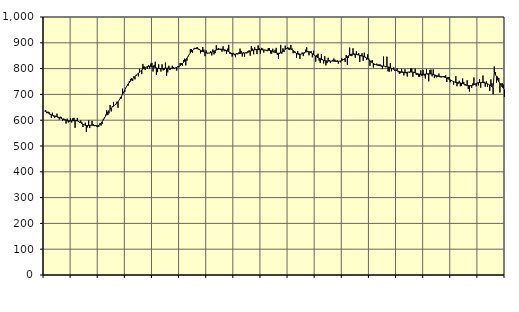
| Category | Piggar | Series 1 |
|---|---|---|
| nan | 635.8 | 635.22 |
| 87.0 | 639.2 | 633.33 |
| 87.0 | 627.2 | 631.18 |
| 87.0 | 633.3 | 628.64 |
| 87.0 | 631.3 | 626.18 |
| 87.0 | 620.2 | 623.75 |
| 87.0 | 608.4 | 621.52 |
| 87.0 | 629.1 | 619.48 |
| 87.0 | 614.6 | 617.67 |
| 87.0 | 609.2 | 616.18 |
| 87.0 | 616.9 | 614.82 |
| 87.0 | 625.4 | 613.54 |
| nan | 609.7 | 612.13 |
| 88.0 | 602.8 | 610.52 |
| 88.0 | 613.5 | 608.64 |
| 88.0 | 612.7 | 606.52 |
| 88.0 | 597.7 | 604.41 |
| 88.0 | 606.2 | 602.5 |
| 88.0 | 604.1 | 600.86 |
| 88.0 | 586.9 | 599.54 |
| 88.0 | 605.7 | 598.56 |
| 88.0 | 591.1 | 597.95 |
| 88.0 | 595 | 597.66 |
| 88.0 | 606.8 | 597.64 |
| nan | 591 | 597.83 |
| 89.0 | 607.4 | 598.1 |
| 89.0 | 609.1 | 598.35 |
| 89.0 | 570.4 | 598.39 |
| 89.0 | 599.9 | 597.93 |
| 89.0 | 608.9 | 596.9 |
| 89.0 | 596.8 | 595.23 |
| 89.0 | 591.5 | 592.95 |
| 89.0 | 599 | 590.24 |
| 89.0 | 592.1 | 587.35 |
| 89.0 | 573.6 | 584.61 |
| 89.0 | 583 | 582.26 |
| nan | 590.2 | 580.51 |
| 90.0 | 554.4 | 579.52 |
| 90.0 | 572.1 | 579.17 |
| 90.0 | 599 | 579.41 |
| 90.0 | 569.5 | 580.02 |
| 90.0 | 581.3 | 580.53 |
| 90.0 | 597.3 | 580.66 |
| 90.0 | 584.3 | 580.34 |
| 90.0 | 576.8 | 579.59 |
| 90.0 | 581.5 | 578.76 |
| 90.0 | 575.7 | 578.39 |
| 90.0 | 573.2 | 578.85 |
| nan | 574.5 | 580.53 |
| 91.0 | 588 | 583.68 |
| 91.0 | 579.1 | 588.31 |
| 91.0 | 586 | 594.16 |
| 91.0 | 605.4 | 600.95 |
| 91.0 | 611.6 | 608.39 |
| 91.0 | 621.3 | 616.11 |
| 91.0 | 638.4 | 623.67 |
| 91.0 | 619.7 | 630.74 |
| 91.0 | 626.5 | 637.09 |
| 91.0 | 659 | 642.47 |
| 91.0 | 634 | 646.98 |
| nan | 653.8 | 650.87 |
| 92.0 | 670.9 | 654.46 |
| 92.0 | 658.4 | 658.07 |
| 92.0 | 659.5 | 662.07 |
| 92.0 | 671.4 | 666.63 |
| 92.0 | 647.9 | 671.82 |
| 92.0 | 677.5 | 677.72 |
| 92.0 | 687.6 | 684.43 |
| 92.0 | 684 | 691.93 |
| 92.0 | 722.5 | 700.16 |
| 92.0 | 706 | 708.77 |
| 92.0 | 709.8 | 717.35 |
| nan | 726.6 | 725.66 |
| 93.0 | 733.6 | 733.27 |
| 93.0 | 734.3 | 740.02 |
| 93.0 | 751.4 | 746.06 |
| 93.0 | 760.1 | 751.41 |
| 93.0 | 762 | 756.18 |
| 93.0 | 751.8 | 760.64 |
| 93.0 | 769.9 | 764.85 |
| 93.0 | 758.3 | 769.03 |
| 93.0 | 776.1 | 773.23 |
| 93.0 | 777.8 | 777.51 |
| 93.0 | 769.7 | 781.92 |
| nan | 799.1 | 786.3 |
| 94.0 | 790.3 | 790.58 |
| 94.0 | 778.5 | 794.63 |
| 94.0 | 818.1 | 798.2 |
| 94.0 | 808.9 | 801.27 |
| 94.0 | 794.8 | 803.93 |
| 94.0 | 806.3 | 806.07 |
| 94.0 | 798.6 | 807.67 |
| 94.0 | 813.2 | 808.71 |
| 94.0 | 800.3 | 809.13 |
| 94.0 | 819.2 | 808.95 |
| 94.0 | 822.6 | 808.29 |
| nan | 788.6 | 807.15 |
| 95.0 | 814.4 | 805.64 |
| 95.0 | 826.7 | 804.1 |
| 95.0 | 776 | 802.64 |
| 95.0 | 786.5 | 801.35 |
| 95.0 | 816.6 | 800.46 |
| 95.0 | 798.3 | 800.02 |
| 95.0 | 788.6 | 799.94 |
| 95.0 | 816.6 | 800.19 |
| 95.0 | 793 | 800.61 |
| 95.0 | 795.5 | 801.14 |
| 95.0 | 823.4 | 801.55 |
| nan | 772.8 | 801.8 |
| 96.0 | 785.7 | 801.83 |
| 96.0 | 811.1 | 801.55 |
| 96.0 | 794.5 | 801.18 |
| 96.0 | 801.4 | 800.99 |
| 96.0 | 811.1 | 800.91 |
| 96.0 | 805.1 | 801.14 |
| 96.0 | 798.2 | 801.92 |
| 96.0 | 802 | 803.22 |
| 96.0 | 792.3 | 804.94 |
| 96.0 | 809.6 | 807.02 |
| 96.0 | 804.9 | 809.36 |
| nan | 822 | 812.07 |
| 97.0 | 821.5 | 815.38 |
| 97.0 | 810.8 | 819.34 |
| 97.0 | 832.6 | 823.92 |
| 97.0 | 838.5 | 829.12 |
| 97.0 | 812.4 | 834.83 |
| 97.0 | 830.4 | 840.97 |
| 97.0 | 848.9 | 847.5 |
| 97.0 | 853.7 | 854.23 |
| 97.0 | 875.2 | 860.78 |
| 97.0 | 875.2 | 866.71 |
| 97.0 | 861.5 | 871.63 |
| nan | 877.1 | 875.21 |
| 98.0 | 880.6 | 877.29 |
| 98.0 | 877.4 | 877.93 |
| 98.0 | 883.7 | 877.33 |
| 98.0 | 877.5 | 875.71 |
| 98.0 | 876.2 | 873.56 |
| 98.0 | 859.2 | 871.22 |
| 98.0 | 865.1 | 868.88 |
| 98.0 | 883.6 | 866.7 |
| 98.0 | 873.6 | 864.68 |
| 98.0 | 848.3 | 862.88 |
| 98.0 | 870.6 | 861.47 |
| nan | 858.5 | 860.59 |
| 99.0 | 860 | 860.3 |
| 99.0 | 859.6 | 860.67 |
| 99.0 | 867.2 | 861.63 |
| 99.0 | 850.9 | 863.12 |
| 99.0 | 874.3 | 865.07 |
| 99.0 | 854.9 | 867.4 |
| 99.0 | 860 | 869.83 |
| 99.0 | 890.2 | 871.92 |
| 99.0 | 876.9 | 873.49 |
| 99.0 | 879.2 | 874.55 |
| 99.0 | 876.4 | 875.18 |
| nan | 871.8 | 875.31 |
| 0.0 | 865.6 | 875 |
| 0.0 | 886.4 | 874.3 |
| 0.0 | 867.1 | 873.21 |
| 0.0 | 868.1 | 871.74 |
| 0.0 | 856.6 | 869.93 |
| 0.0 | 877.2 | 867.72 |
| 0.0 | 892.1 | 865.23 |
| 0.0 | 857 | 862.65 |
| 0.0 | 857.3 | 860.17 |
| 0.0 | 846.5 | 858.17 |
| 0.0 | 859.5 | 856.82 |
| nan | 851.8 | 856.19 |
| 1.0 | 844.1 | 856.22 |
| 1.0 | 860.1 | 856.71 |
| 1.0 | 855.4 | 857.54 |
| 1.0 | 863.1 | 858.48 |
| 1.0 | 877.4 | 859.3 |
| 1.0 | 868.6 | 859.9 |
| 1.0 | 847 | 860.16 |
| 1.0 | 862.8 | 860.23 |
| 1.0 | 846.2 | 860.51 |
| 1.0 | 862.2 | 861.08 |
| 1.0 | 858.9 | 862 |
| nan | 867.8 | 863.36 |
| 2.0 | 871.2 | 865.11 |
| 2.0 | 850.1 | 867.08 |
| 2.0 | 887.4 | 869.03 |
| 2.0 | 877.4 | 870.76 |
| 2.0 | 855.4 | 872.08 |
| 2.0 | 882.6 | 872.93 |
| 2.0 | 874 | 873.39 |
| 2.0 | 856.1 | 873.52 |
| 2.0 | 890 | 873.44 |
| 2.0 | 879.5 | 873.33 |
| 2.0 | 858.4 | 873.16 |
| nan | 880 | 872.95 |
| 3.0 | 878.2 | 872.66 |
| 3.0 | 862 | 872.24 |
| 3.0 | 872.6 | 871.77 |
| 3.0 | 870.5 | 871.34 |
| 3.0 | 867.4 | 871.06 |
| 3.0 | 879.6 | 870.87 |
| 3.0 | 879.6 | 870.55 |
| 3.0 | 858.9 | 869.89 |
| 3.0 | 857.8 | 868.8 |
| 3.0 | 876.7 | 867.11 |
| 3.0 | 862.3 | 865.05 |
| nan | 872.7 | 862.92 |
| 4.0 | 880.3 | 861.01 |
| 4.0 | 853.4 | 859.77 |
| 4.0 | 837.1 | 859.41 |
| 4.0 | 856.8 | 860.03 |
| 4.0 | 891.7 | 861.68 |
| 4.0 | 857.8 | 864.24 |
| 4.0 | 878.7 | 867.42 |
| 4.0 | 864.2 | 871 |
| 4.0 | 889 | 874.52 |
| 4.0 | 879.7 | 877.37 |
| 4.0 | 882 | 879.15 |
| nan | 873.8 | 879.59 |
| 5.0 | 871.7 | 878.56 |
| 5.0 | 891.3 | 876.31 |
| 5.0 | 878.2 | 873.25 |
| 5.0 | 859.6 | 869.68 |
| 5.0 | 862.2 | 865.8 |
| 5.0 | 865.2 | 862.01 |
| 5.0 | 840.8 | 858.79 |
| 5.0 | 867.5 | 856.43 |
| 5.0 | 859.9 | 855.13 |
| 5.0 | 837.7 | 854.98 |
| 5.0 | 855.8 | 855.88 |
| nan | 862.6 | 857.58 |
| 6.0 | 848.5 | 859.84 |
| 6.0 | 859.3 | 862.17 |
| 6.0 | 873.3 | 864.02 |
| 6.0 | 882.6 | 865.18 |
| 6.0 | 868.4 | 865.55 |
| 6.0 | 851.4 | 864.89 |
| 6.0 | 866.4 | 863.25 |
| 6.0 | 867.3 | 860.85 |
| 6.0 | 843.8 | 857.79 |
| 6.0 | 869.2 | 854.5 |
| 6.0 | 852.1 | 851.33 |
| nan | 827.2 | 848.27 |
| 7.0 | 853.2 | 845.4 |
| 7.0 | 857.9 | 842.79 |
| 7.0 | 830.4 | 840.35 |
| 7.0 | 821.4 | 838 |
| 7.0 | 856.6 | 835.76 |
| 7.0 | 835.8 | 833.78 |
| 7.0 | 820.1 | 832.17 |
| 7.0 | 848 | 830.86 |
| 7.0 | 812.6 | 829.95 |
| 7.0 | 821.2 | 829.43 |
| 7.0 | 842.1 | 829.2 |
| nan | 832.2 | 829.18 |
| 8.0 | 821.1 | 829.24 |
| 8.0 | 828.5 | 829.18 |
| 8.0 | 833.8 | 829.06 |
| 8.0 | 839 | 828.91 |
| 8.0 | 834.3 | 828.63 |
| 8.0 | 826.8 | 828.26 |
| 8.0 | 832.3 | 828.02 |
| 8.0 | 818.9 | 828.11 |
| 8.0 | 828.9 | 828.66 |
| 8.0 | 824.1 | 829.79 |
| 8.0 | 840.1 | 831.44 |
| nan | 836.1 | 833.68 |
| 9.0 | 834 | 836.46 |
| 9.0 | 826.2 | 839.63 |
| 9.0 | 852.8 | 842.93 |
| 9.0 | 814.6 | 846.26 |
| 9.0 | 840.9 | 849.43 |
| 9.0 | 881.1 | 852.23 |
| 9.0 | 848.6 | 854.51 |
| 9.0 | 848.6 | 856.07 |
| 9.0 | 878.7 | 856.86 |
| 9.0 | 852.5 | 856.91 |
| 9.0 | 842.2 | 856.26 |
| nan | 867.6 | 855.05 |
| 10.0 | 854.8 | 853.67 |
| 10.0 | 860.2 | 852.33 |
| 10.0 | 825.6 | 851.04 |
| 10.0 | 852.4 | 849.82 |
| 10.0 | 859.5 | 848.67 |
| 10.0 | 829.9 | 847.44 |
| 10.0 | 861.7 | 845.88 |
| 10.0 | 845.4 | 843.82 |
| 10.0 | 833.2 | 841.13 |
| 10.0 | 855.6 | 837.8 |
| 10.0 | 838.9 | 834.09 |
| nan | 810.5 | 830.25 |
| 11.0 | 830.2 | 826.46 |
| 11.0 | 833.2 | 823 |
| 11.0 | 804 | 820.05 |
| 11.0 | 814.4 | 817.53 |
| 11.0 | 814.9 | 815.42 |
| 11.0 | 819.2 | 813.87 |
| 11.0 | 815.4 | 812.78 |
| 11.0 | 816.2 | 811.99 |
| 11.0 | 816.6 | 811.44 |
| 11.0 | 808 | 810.94 |
| 11.0 | 798.2 | 810.37 |
| nan | 846.7 | 809.8 |
| 12.0 | 808.8 | 809.16 |
| 12.0 | 805.1 | 808.32 |
| 12.0 | 846.4 | 807.38 |
| 12.0 | 789.6 | 806.36 |
| 12.0 | 787.8 | 805.08 |
| 12.0 | 820.7 | 803.43 |
| 12.0 | 789.4 | 801.51 |
| 12.0 | 800.2 | 799.34 |
| 12.0 | 804.3 | 797.1 |
| 12.0 | 791 | 795.01 |
| 12.0 | 791.8 | 793.22 |
| nan | 800.9 | 791.7 |
| 13.0 | 786.1 | 790.27 |
| 13.0 | 780.4 | 788.77 |
| 13.0 | 782.3 | 787.33 |
| 13.0 | 799.5 | 786.07 |
| 13.0 | 788.7 | 785.21 |
| 13.0 | 773.3 | 784.75 |
| 13.0 | 797.2 | 784.66 |
| 13.0 | 781.5 | 785.03 |
| 13.0 | 769.3 | 785.7 |
| 13.0 | 787.1 | 786.39 |
| 13.0 | 784.3 | 786.92 |
| nan | 800.7 | 787.04 |
| 14.0 | 800.9 | 786.69 |
| 14.0 | 768.4 | 786.01 |
| 14.0 | 787.2 | 784.95 |
| 14.0 | 799.9 | 783.52 |
| 14.0 | 775.3 | 782.01 |
| 14.0 | 776.6 | 780.57 |
| 14.0 | 768.9 | 779.26 |
| 14.0 | 768.1 | 778.21 |
| 14.0 | 793.5 | 777.53 |
| 14.0 | 771.1 | 777.34 |
| 14.0 | 795.1 | 777.54 |
| nan | 772.7 | 778.05 |
| 15.0 | 761.6 | 778.7 |
| 15.0 | 797.7 | 779.33 |
| 15.0 | 777.6 | 779.83 |
| 15.0 | 750.5 | 779.99 |
| 15.0 | 795 | 779.78 |
| 15.0 | 796.2 | 779.28 |
| 15.0 | 770 | 778.47 |
| 15.0 | 796.9 | 777.35 |
| 15.0 | 763.3 | 776.01 |
| 15.0 | 770.2 | 774.48 |
| 15.0 | 766.1 | 772.93 |
| nan | 768.4 | 771.51 |
| 16.0 | 780.7 | 770.41 |
| 16.0 | 766.6 | 769.6 |
| 16.0 | 765.4 | 769.01 |
| 16.0 | 767.9 | 768.58 |
| 16.0 | 770.3 | 767.95 |
| 16.0 | 770.2 | 766.83 |
| 16.0 | 774.1 | 765.25 |
| 16.0 | 748.1 | 763.25 |
| 16.0 | 767.6 | 760.96 |
| 16.0 | 767.4 | 758.66 |
| 16.0 | 747.1 | 756.3 |
| nan | 755.7 | 753.92 |
| 17.0 | 751.5 | 751.64 |
| 17.0 | 737.8 | 749.61 |
| 17.0 | 748.1 | 747.89 |
| 17.0 | 770.5 | 746.57 |
| 17.0 | 731.7 | 745.73 |
| 17.0 | 741.2 | 745.22 |
| 17.0 | 752.9 | 744.88 |
| 17.0 | 731.7 | 744.43 |
| 17.0 | 733.3 | 743.55 |
| 17.0 | 761.5 | 742.11 |
| 17.0 | 748.3 | 740.32 |
| nan | 735 | 738.42 |
| 18.0 | 735 | 736.64 |
| 18.0 | 755 | 735.15 |
| 18.0 | 721.7 | 734.18 |
| 18.0 | 711.3 | 733.77 |
| 18.0 | 732.1 | 733.85 |
| 18.0 | 725.5 | 734.53 |
| 18.0 | 742.9 | 735.81 |
| 18.0 | 765.5 | 737.55 |
| 18.0 | 737.5 | 739.65 |
| 18.0 | 731.4 | 741.77 |
| 18.0 | 745.3 | 743.7 |
| nan | 734.8 | 745.18 |
| 19.0 | 758.5 | 746.03 |
| 19.0 | 725.8 | 746.35 |
| 19.0 | 746.2 | 746.17 |
| 19.0 | 773 | 745.68 |
| 19.0 | 749.1 | 745.04 |
| 19.0 | 729.7 | 744.12 |
| 19.0 | 750.5 | 742.77 |
| 19.0 | 729.6 | 741.03 |
| 19.0 | 738.9 | 738.91 |
| 19.0 | 713.8 | 736.37 |
| 19.0 | 757.8 | 733.25 |
| nan | 743.1 | 729.59 |
| 20.0 | 700.3 | 725.33 |
| 20.0 | 808.5 | 787.39 |
| 20.0 | 786 | 776.23 |
| 20.0 | 745.4 | 769.76 |
| 20.0 | 768.9 | 756.95 |
| 20.0 | 763.8 | 749.7 |
| 20.0 | 707.5 | 742.59 |
| 20.0 | 741.3 | 735.83 |
| 20.0 | 744 | 729.67 |
| 20.0 | 737.6 | 724.18 |
| 20.0 | 691.1 | 719.32 |